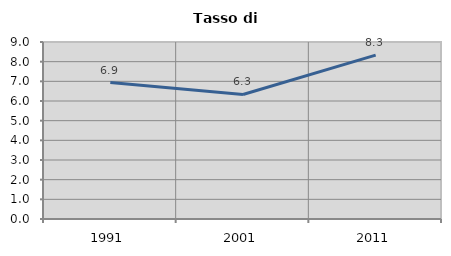
| Category | Tasso di disoccupazione   |
|---|---|
| 1991.0 | 6.938 |
| 2001.0 | 6.332 |
| 2011.0 | 8.333 |